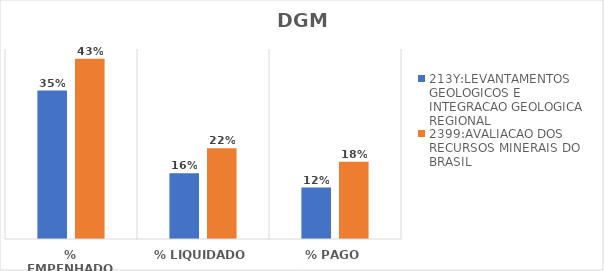
| Category | 213Y:LEVANTAMENTOS GEOLOGICOS E INTEGRACAO GEOLOGICA REGIONAL | 2399:AVALIACAO DOS RECURSOS MINERAIS DO BRASIL |
|---|---|---|
| % EMPENHADO | 0.352 | 0.427 |
| % LIQUIDADO | 0.155 | 0.215 |
| % PAGO | 0.122 | 0.183 |